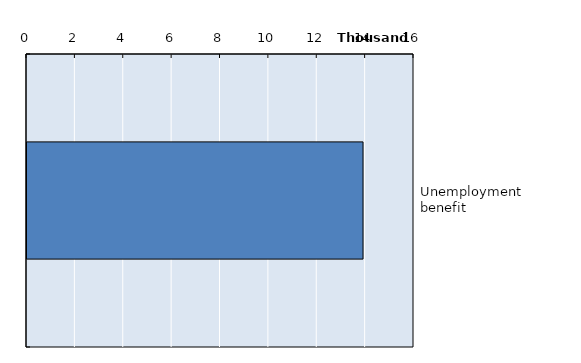
| Category | Series 0 |
|---|---|
| Unemployment benefit | 13893 |